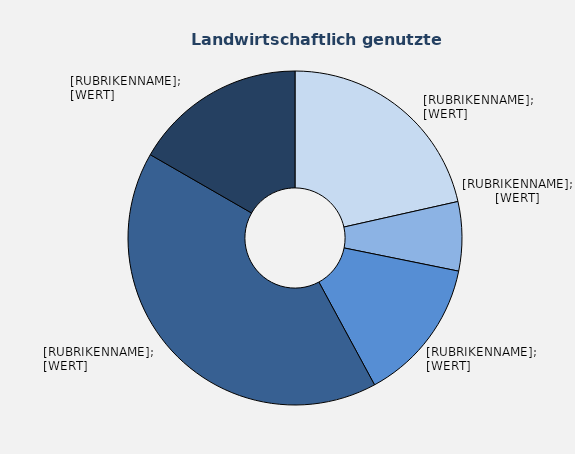
| Category | Series 1 |
|---|---|
| Ackerbaubetriebe | 21.493 |
| Gartenbaubetriebe | 6.688 |
| Dauerkulturbetriebe | 13.919 |
| Futterbaubetriebe | 41.214 |
| Veredlungs- und Verbundbetriebe | 16.686 |